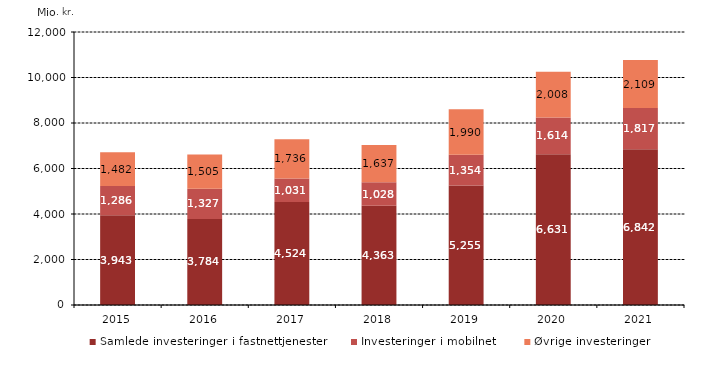
| Category | Samlede investeringer i fastnettjenester | Investeringer i mobilnet | Øvrige investeringer |
|---|---|---|---|
| 2015.0 | 3942.948 | 1286.307 | 1482.137 |
| 2016.0 | 3783.652 | 1326.949 | 1504.618 |
| 2017.0 | 4524.283 | 1030.872 | 1735.837 |
| 2018.0 | 4363.239 | 1028.402 | 1636.992 |
| 2019.0 | 5255.42 | 1353.757 | 1990.352 |
| 2020.0 | 6631 | 1614.284 | 2008.334 |
| 2021.0 | 6841.768 | 1816.88 | 2109.09 |